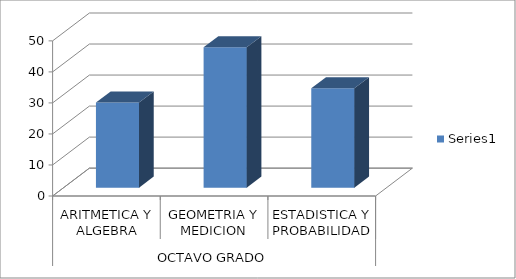
| Category | Series 0 |
|---|---|
| 0 | 27.42 |
| 1 | 45.22 |
| 2 | 32 |